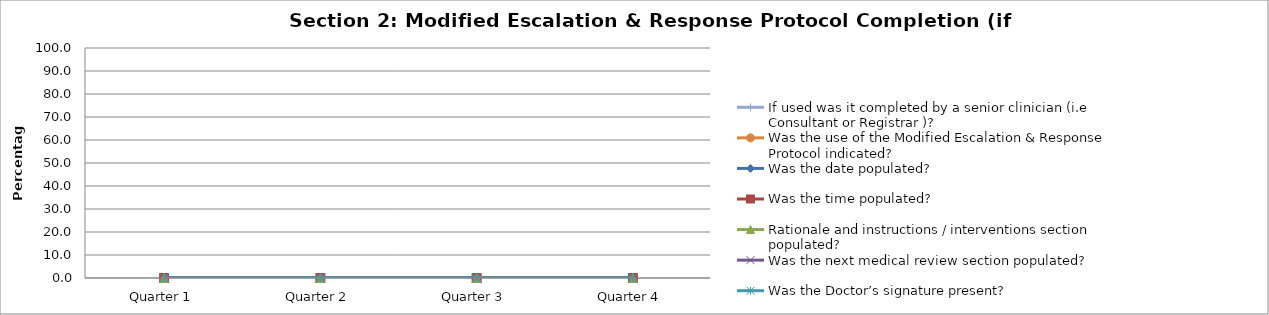
| Category | If used was it completed by a senior clinician (i.e Consultant or Registrar )? | Was the use of the Modified Escalation & Response Protocol indicated? | Was the date populated? | Was the time populated? | Rationale and instructions / interventions section populated? | Was the next medical review section populated? | Was the Doctor’s signature present? |
|---|---|---|---|---|---|---|---|
| Quarter 1 | 0 | 0 | 0 | 0 | 0 | 0 | 0 |
| Quarter 2 | 0 | 0 | 0 | 0 | 0 | 0 | 0 |
| Quarter 3 | 0 | 0 | 0 | 0 | 0 | 0 | 0 |
| Quarter 4 | 0 | 0 | 0 | 0 | 0 | 0 | 0 |